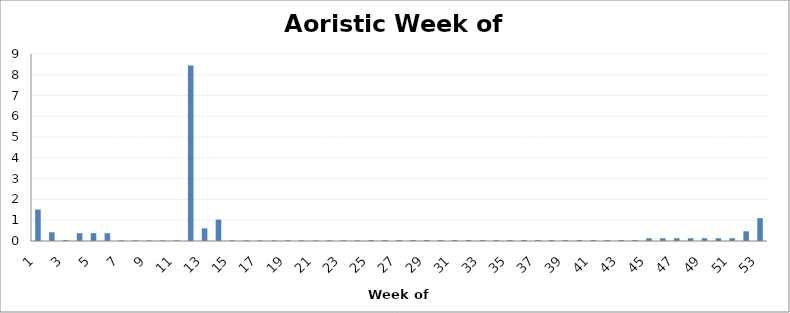
| Category |   |
|---|---|
| 1.0 | 1.514 |
| 2.0 | 0.419 |
| 3.0 | 0.042 |
| 4.0 | 0.376 |
| 5.0 | 0.376 |
| 6.0 | 0.376 |
| 7.0 | 0.031 |
| 8.0 | 0.031 |
| 9.0 | 0.031 |
| 10.0 | 0.031 |
| 11.0 | 0.031 |
| 12.0 | 8.452 |
| 13.0 | 0.609 |
| 14.0 | 1.031 |
| 15.0 | 0.031 |
| 16.0 | 0.031 |
| 17.0 | 0.031 |
| 18.0 | 0.031 |
| 19.0 | 0.031 |
| 20.0 | 0.031 |
| 21.0 | 0.031 |
| 22.0 | 0.031 |
| 23.0 | 0.031 |
| 24.0 | 0.031 |
| 25.0 | 0.042 |
| 26.0 | 0.042 |
| 27.0 | 0.042 |
| 28.0 | 0.042 |
| 29.0 | 0.042 |
| 30.0 | 0.042 |
| 31.0 | 0.042 |
| 32.0 | 0.042 |
| 33.0 | 0.042 |
| 34.0 | 0.042 |
| 35.0 | 0.042 |
| 36.0 | 0.042 |
| 37.0 | 0.042 |
| 38.0 | 0.042 |
| 39.0 | 0.042 |
| 40.0 | 0.042 |
| 41.0 | 0.042 |
| 42.0 | 0.042 |
| 43.0 | 0.042 |
| 44.0 | 0.042 |
| 45.0 | 0.133 |
| 46.0 | 0.133 |
| 47.0 | 0.133 |
| 48.0 | 0.133 |
| 49.0 | 0.133 |
| 50.0 | 0.133 |
| 51.0 | 0.133 |
| 52.0 | 0.466 |
| 53.0 | 1.102 |